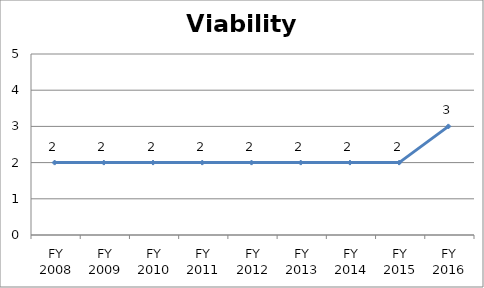
| Category | Viability score |
|---|---|
| FY 2016 | 3 |
| FY 2015 | 2 |
| FY 2014 | 2 |
| FY 2013 | 2 |
| FY 2012 | 2 |
| FY 2011 | 2 |
| FY 2010 | 2 |
| FY 2009 | 2 |
| FY 2008 | 2 |